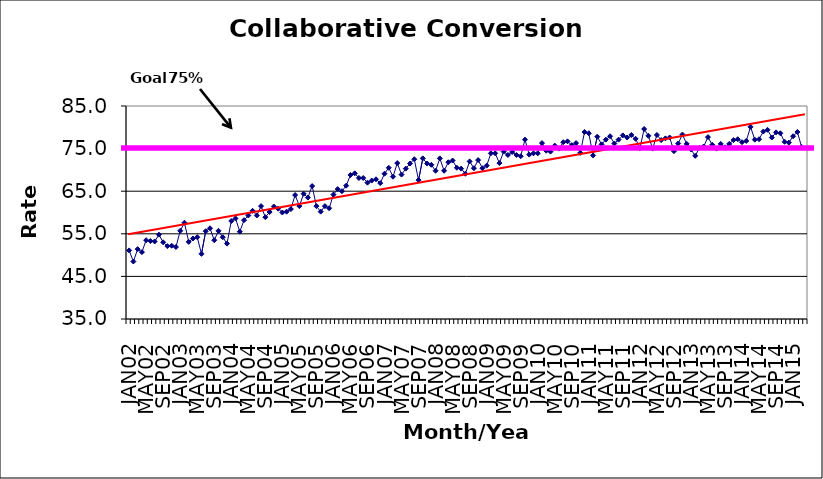
| Category | Series 0 |
|---|---|
| JAN02 | 51.1 |
| FEB02 | 48.5 |
| MAR02 | 51.4 |
| APR02 | 50.7 |
| MAY02 | 53.5 |
| JUN02 | 53.3 |
| JUL02 | 53.2 |
| AUG02 | 54.8 |
| SEP02 | 53 |
| OCT02 | 52.1 |
| NOV02 | 52.2 |
| DEC02 | 51.9 |
| JAN03 | 55.7 |
| FEB03 | 57.6 |
| MAR03 | 53.1 |
| APR03 | 53.9 |
| MAY03 | 54.2 |
| JUN03 | 50.3 |
| JUL03 | 55.6 |
| AUG03 | 56.3 |
| SEP03 | 53.5 |
| OCT03 | 55.7 |
| NOV03 | 54.2 |
| DEC03 | 52.7 |
| JAN04 | 58 |
| FEB04 | 58.6 |
| MAR04 | 55.5 |
| APR04 | 58.2 |
| MAY04 | 59.3 |
| JUN04 | 60.4 |
| JUL04 | 59.3 |
| AUG04 | 61.5 |
| SEP04 | 58.9 |
| OCT04 | 60.1 |
| NOV04 | 61.4 |
| DEC04 | 60.9 |
| JAN05 | 60 |
| FEB05 | 60.2 |
| MAR05 | 60.8 |
| APR05 | 64.1 |
| MAY05 | 61.5 |
| JUN05 | 64.4 |
| JUL05 | 63.5 |
| AUG05 | 66.2 |
| SEP05 | 61.5 |
| OCT05 | 60.2 |
| NOV05 | 61.5 |
| DEC05 | 61 |
| JAN06 | 64.2 |
| FEB06 | 65.5 |
| MAR06 | 65 |
| APR06 | 66.3 |
| MAY06 | 68.8 |
| JUN06 | 69.2 |
| JUL06 | 68.1 |
| AUG06 | 68.1 |
| SEP06 | 67 |
| OCT06 | 67.5 |
| NOV06 | 67.8 |
| DEC06 | 66.9 |
| JAN07 | 69.1 |
| FEB07 | 70.5 |
| MAR07 | 68.4 |
| APR07 | 71.6 |
| MAY07 | 68.9 |
| JUN07 | 70.3 |
| JUL07 | 71.5 |
| AUG07 | 72.5 |
| SEP07 | 67.6 |
| OCT07 | 72.7 |
| NOV07 | 71.5 |
| DEC07 | 71.2 |
| JAN08 | 69.8 |
| FEB08 | 72.7 |
| MAR08 | 69.8 |
| APR08 | 71.8 |
| MAY08 | 72.2 |
| JUN08 | 70.5 |
| JUL08 | 70.3 |
| AUG08 | 69.1 |
| SEP08 | 72 |
| OCT08 | 70.4 |
| NOV08 | 72.3 |
| DEC08 | 70.4 |
| JAN09 | 71 |
| FEB09 | 73.9 |
| MAR09 | 73.9 |
| APR09 | 71.6 |
| MAY09 | 74.3 |
| JUN09 | 73.5 |
| JUL09 | 74.2 |
| AUG09 | 73.5 |
| SEP09 | 73.2 |
| OCT09 | 77.1 |
| NOV09 | 73.6 |
| DEC09 | 73.9 |
| JAN10 | 73.9 |
| FEB10 | 76.3 |
| MAR10 | 74.5 |
| APR10 | 74.3 |
| MAY10 | 75.7 |
| JUN10 | 75 |
| JUL10 | 76.5 |
| AUG10 | 76.7 |
| SEP10 | 75.8 |
| OCT10 | 76.3 |
| NOV10 | 74 |
| DEC10 | 78.9 |
| JAN11 | 78.6 |
| FEB11 | 73.4 |
| MAR11 | 77.8 |
| APR11 | 76 |
| MAY11 | 77.1 |
| JUN11 | 77.9 |
| JUL11 | 76.2 |
| AUG11 | 77.1 |
| SEP11 | 78.1 |
| OCT11 | 77.6 |
| NOV11 | 78.2 |
| DEC11 | 77.3 |
| JAN12 | 75.1 |
| FEB12 | 79.6 |
| MAR12 | 78 |
| APR12 | 75 |
| MAY12 | 78.2 |
| JUN12 | 77 |
| JUL12 | 77.4 |
| AUG12 | 77.6 |
| SEP12 | 74.4 |
| OCT12 | 76.2 |
| NOV12 | 78.3 |
| DEC12 | 76.1 |
| JAN13 | 74.8 |
| FEB13 | 73.3 |
| MAR13 | 75.2 |
| APR13 | 75.5 |
| MAY13 | 77.7 |
| JUN13 | 75.9 |
| JUL13 | 75 |
| AUG13 | 76.1 |
| SEP13 | 75.3 |
| OCT13 | 76.1 |
| NOV13 | 77 |
| DEC13 | 77.2 |
| JAN14 | 76.5 |
| FEB14 | 76.8 |
| MAR14 | 80.1 |
| APR14 | 77.1 |
| MAY14 | 77.2 |
| JUN14 | 79 |
| JUL14 | 79.4 |
| AUG14 | 77.6 |
| SEP14 | 78.8 |
| OCT14 | 78.6 |
| NOV14 | 76.6 |
| DEC14 | 76.4 |
| JAN15 | 77.9 |
| FEB15 | 78.9 |
| MAR15 | 75.4 |